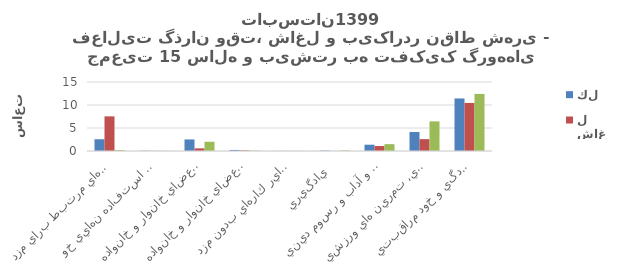
| Category | كل | شاغل | بيكار |
|---|---|---|---|
| اشتغال و فعاليت هاي مرتبط براي مزد  | 2.56 | 7.53 | 0.21 |
| توليد كالا براي استفاده نهايي خود   | 0.05 | 0.02 | 0.03 |
| خدمات خانگي بدون مزد براي اعضاي خانوار و خانواده   | 2.51 | 0.58 | 2.01 |
| خدمات مراقبتي بدون مزد براي اعضاي خانوار و خانواده   | 0.23 | 0.14 | 0.08 |
| كارداوطلبانه بدون مزد، كار آموزي و ساير كارهاي بدون مزد  | 0.02 | 0.01 | 0.02 |
| يادگيري  | 0.1 | 0.01 | 0.11 |
| معاشرت، ارتباط، مشاركت اجتماعي و آداب و رسوم ديني  | 1.37 | 1.08 | 1.49 |
| فرهنگ، فراغت، رسانه هاي گروهي، تمرين هاي ورزشي  | 4.13 | 2.58 | 6.44 |
| رسيدگي و خود مراقبتي   | 11.42 | 10.45 | 12.41 |